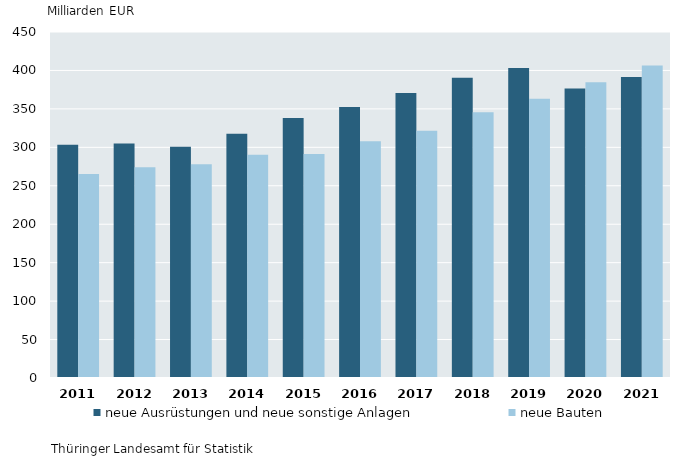
| Category | neue Ausrüstungen und neue sonstige Anlagen | neue Bauten |
|---|---|---|
| 2011.0 | 303.312 | 265.259 |
| 2012.0 | 304.876 | 274.178 |
| 2013.0 | 300.875 | 278.15 |
| 2014.0 | 317.58 | 290.199 |
| 2015.0 | 338.294 | 291.243 |
| 2016.0 | 352.299 | 307.923 |
| 2017.0 | 370.527 | 321.721 |
| 2018.0 | 390.359 | 345.489 |
| 2019.0 | 403.305 | 363.109 |
| 2020.0 | 376.391 | 384.633 |
| 2021.0 | 391.341 | 406.54 |